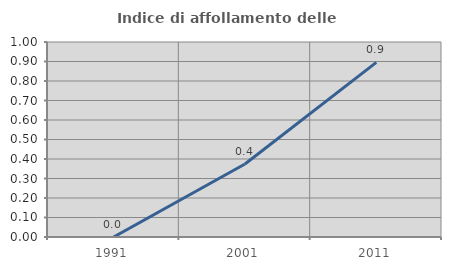
| Category | Indice di affollamento delle abitazioni  |
|---|---|
| 1991.0 | 0 |
| 2001.0 | 0.375 |
| 2011.0 | 0.896 |